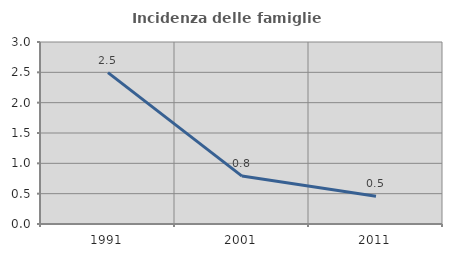
| Category | Incidenza delle famiglie numerose |
|---|---|
| 1991.0 | 2.495 |
| 2001.0 | 0.79 |
| 2011.0 | 0.459 |